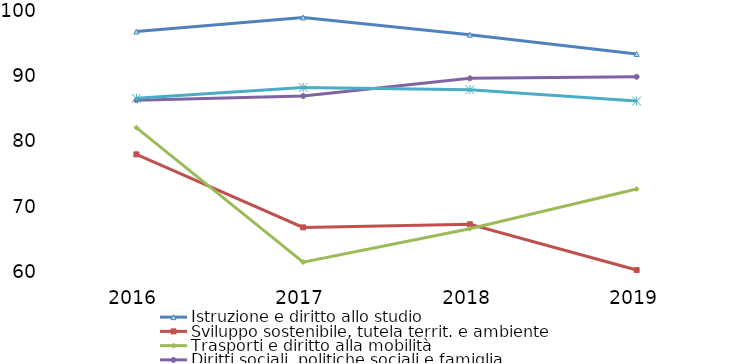
| Category | Istruzione e diritto allo studio | Sviluppo sostenibile, tutela territ. e ambiente | Trasporti e diritto alla mobilità | Diritti sociali, politiche sociali e famiglia | Tutela della salute  |
|---|---|---|---|---|---|
| 2016.0 | 96.859 | 78.031 | 82.121 | 86.314 | 86.613 |
| 2017.0 | 99.007 | 66.835 | 61.512 | 86.963 | 88.277 |
| 2018.0 | 96.362 | 67.309 | 66.64 | 89.682 | 87.922 |
| 2019.0 | 93.419 | 60.301 | 72.727 | 89.923 | 86.198 |